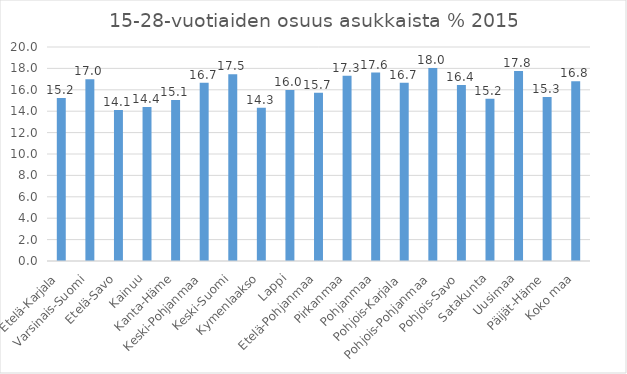
| Category | 15-28-vuotiaiden osuus asukkaista % |
|---|---|
| Etelä-Karjala | 15.23 |
| Varsinais-Suomi | 16.99 |
| Etelä-Savo | 14.11 |
| Kainuu | 14.39 |
| Kanta-Häme | 15.05 |
| Keski-Pohjanmaa | 16.66 |
| Keski-Suomi | 17.46 |
| Kymenlaakso | 14.32 |
| Lappi | 15.99 |
| Etelä-Pohjanmaa | 15.72 |
| Pirkanmaa | 17.32 |
| Pohjanmaa | 17.61 |
| Pohjois-Karjala | 16.66 |
| Pohjois-Pohjanmaa | 18.04 |
| Pohjois-Savo | 16.44 |
| Satakunta | 15.16 |
| Uusimaa | 17.75 |
| Päijät-Häme | 15.33 |
| Koko maa | 16.8 |